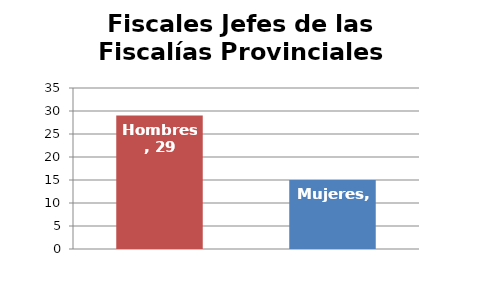
| Category | Fiscales Jefes de las Fiscalías Provinciales |
|---|---|
| Hombres | 29 |
| Mujeres | 15 |